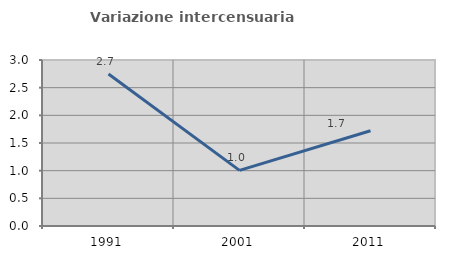
| Category | Variazione intercensuaria annua |
|---|---|
| 1991.0 | 2.746 |
| 2001.0 | 1.005 |
| 2011.0 | 1.721 |